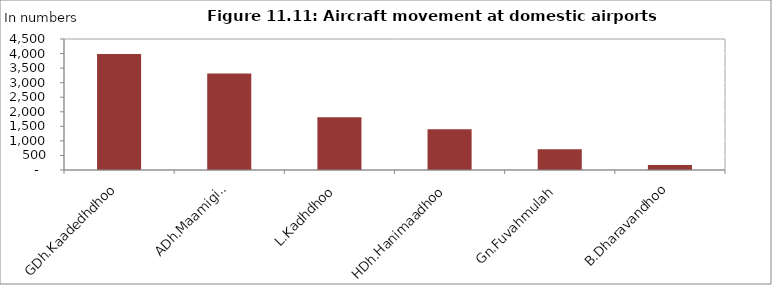
| Category | 2012  |
|---|---|
| GDh.Kaadedhdhoo | 3982 |
| ADh.Maamigili | 3315 |
| L.Kadhdhoo | 1816 |
| HDh.Hanimaadhoo | 1397 |
| Gn.Fuvahmulah  | 710 |
| B.Dharavandhoo | 173 |